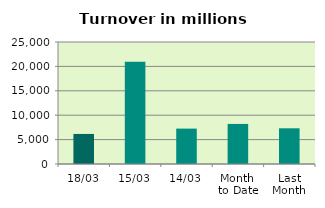
| Category | Series 0 |
|---|---|
| 18/03 | 6158.333 |
| 15/03 | 20955.952 |
| 14/03 | 7251.091 |
| Month 
to Date | 8208.036 |
| Last
Month | 7315.261 |